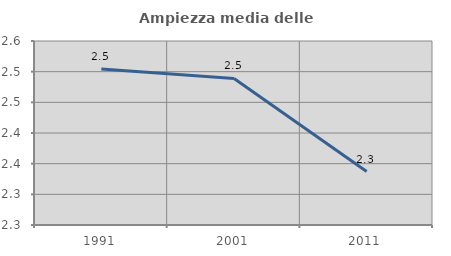
| Category | Ampiezza media delle famiglie |
|---|---|
| 1991.0 | 2.504 |
| 2001.0 | 2.489 |
| 2011.0 | 2.337 |